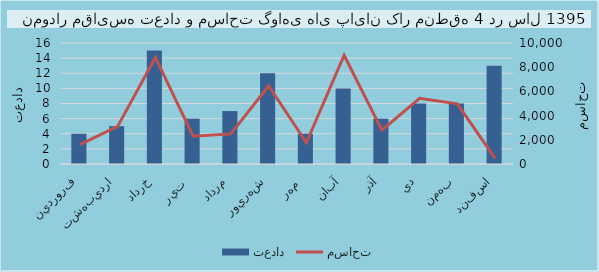
| Category | تعداد |
|---|---|
| فروردين | 4 |
| ارديبهشت | 5 |
| خرداد | 15 |
| تير  | 6 |
| مرداد | 7 |
| شهريور | 12 |
| مهر  | 4 |
| آبان | 10 |
| آذر | 6 |
| دي | 8 |
| بهمن | 8 |
| اسفند | 13 |